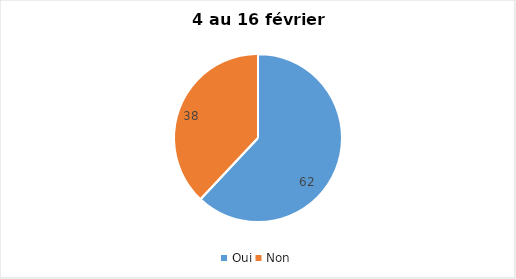
| Category | Series 0 |
|---|---|
| Oui | 62 |
| Non | 38 |